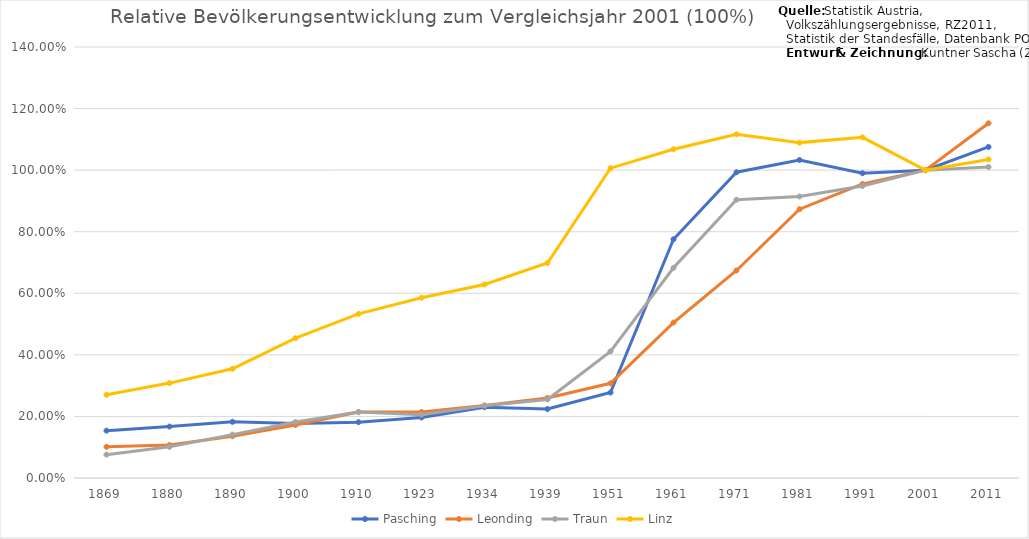
| Category | Pasching | Leonding | Traun | Linz |
|---|---|---|---|---|
| 1869.0 | 0.154 | 0.101 | 0.076 | 0.27 |
| 1880.0 | 0.167 | 0.107 | 0.101 | 0.308 |
| 1890.0 | 0.183 | 0.136 | 0.141 | 0.355 |
| 1900.0 | 0.177 | 0.172 | 0.182 | 0.454 |
| 1910.0 | 0.181 | 0.214 | 0.214 | 0.533 |
| 1923.0 | 0.196 | 0.214 | 0.206 | 0.586 |
| 1934.0 | 0.23 | 0.236 | 0.235 | 0.629 |
| 1939.0 | 0.224 | 0.26 | 0.255 | 0.698 |
| 1951.0 | 0.278 | 0.308 | 0.411 | 1.006 |
| 1961.0 | 0.775 | 0.505 | 0.683 | 1.068 |
| 1971.0 | 0.993 | 0.674 | 0.904 | 1.117 |
| 1981.0 | 1.033 | 0.873 | 0.915 | 1.089 |
| 1991.0 | 0.99 | 0.955 | 0.948 | 1.106 |
| 2001.0 | 1 | 1 | 1 | 1 |
| 2011.0 | 1.075 | 1.152 | 1.01 | 1.035 |